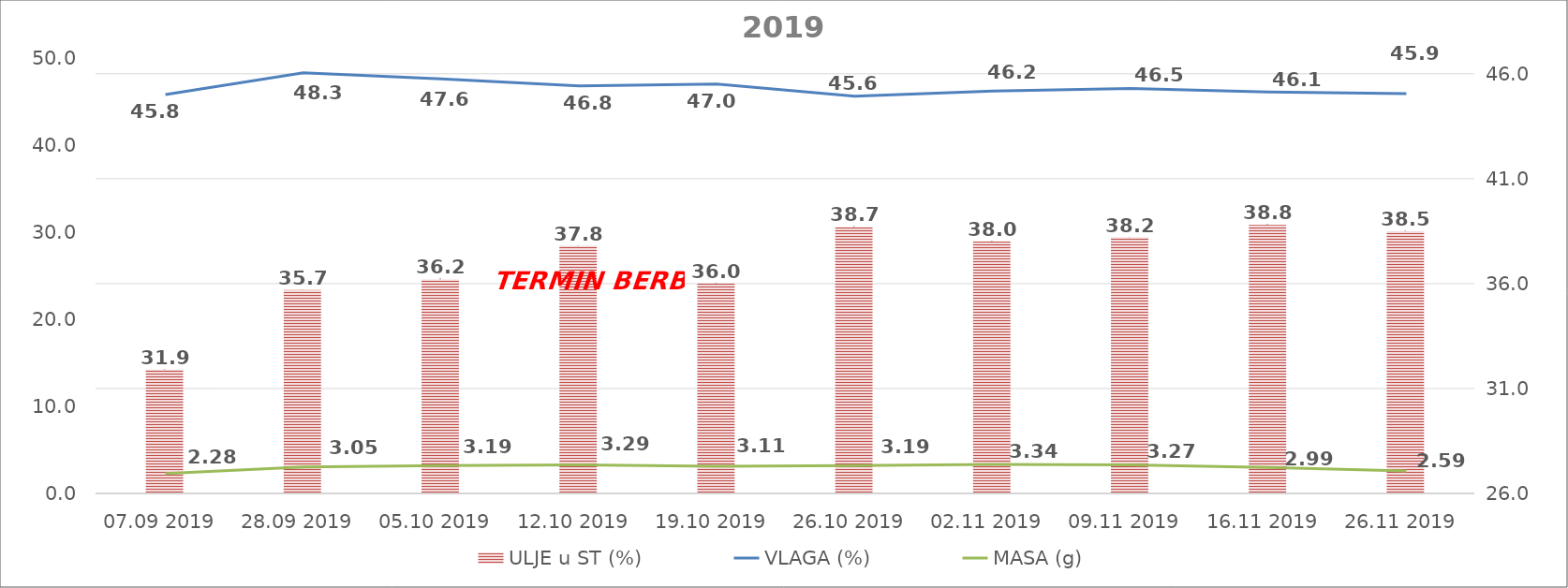
| Category | ULJE u ST (%) |
|---|---|
| 07.09 2019 | 31.9 |
| 28.09 2019 | 35.7 |
| 05.10 2019 | 36.2 |
| 12.10 2019 | 37.8 |
| 19.10 2019 | 36 |
| 26.10 2019 | 38.7 |
| 02.11 2019 | 38 |
| 09.11 2019 | 38.2 |
| 16.11 2019 | 38.8 |
| 26.11 2019 | 38.5 |